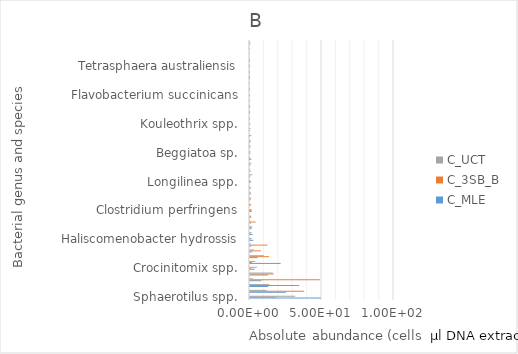
| Category | C_MLE  | C_3SB_B | C_UCT |
|---|---|---|---|
| Sphaerotilus spp. | 49.07 | 18.095 | 31.364 |
| Lewinella spp. | 24.884 | 37.664 | 11.495 |
| Tetrasphaera spp. | 12.585 | 34.158 | 13.423 |
| Lewinella sp. | 8.008 | 48.48 | 1.933 |
| Bellilinea spp. | 12.57 | 16.452 | 15.893 |
| Crocinitomix spp. | 3.218 | 0.713 | 4.715 |
| Haliscomenobacter spp. | 21.262 | 1.252 | 3.682 |
| Mycobacterium spp. | 5.26 | 13.203 | 9.741 |
| Candidatus microthrix parvicella | 1.35 | 7.605 | 2.726 |
| Candidatus monilibacter batavus | 0.831 | 12.097 | 0.792 |
| Haliscomenobacter hydrossis | 2.232 | 0.335 | 1.093 |
| Fluviicola spp. | 1.832 | 0.357 | 0.969 |
| Haliscomenobacter sp. | 0.984 | 1.19 | 1.534 |
| Levilinea spp. | 0.647 | 3.913 | 0.182 |
| Flavobacterium gelidilacus | 0.929 | 0.604 | 0 |
| Clostridium perfringens | 1.299 | 0.862 | 1.093 |
| Anaerolinea spp. | 0.294 | 0.766 | 0.071 |
| Tetrasphaera sp. | 0.43 | 0.418 | 0.848 |
| Acinetobacter johnsonii | 0.353 | 0.643 | 0.485 |
| Kouleothrix aurantiaca | 0.52 | 0.326 | 0.087 |
| Longilinea spp. | 0.232 | 0.725 | 0.143 |
| Aquicella lusitana | 0.112 | 0.045 | 1.601 |
| Anaerolinea thermolimosa | 0.509 | 0 | 0.021 |
| Tetrasphaera jenkinsii | 0.262 | 0.05 | 1.002 |
| Candidatus alysiosphaera europeae | 0.867 | 0.226 | 0.138 |
| Beggiatoa sp. | 0.181 | 0.08 | 0.439 |
| Uncultured candidatus microthrix sp. | 0.102 | 0.1 | 0.542 |
| Aquicella spp. | 0.021 | 0.704 | 0.035 |
| Levilinea saccharolytica | 0.048 | 0.861 | 0 |
| Crenothrix polyspora | 0.071 | 0 | 0.305 |
| Kouleothrix spp. | 0 | 0.23 | 0 |
| Gordonia paraffinivorans | 0.056 | 0.055 | 0 |
| Thiothrix spp. | 0.021 | 0.025 | 0.058 |
| Thiothrix sp. | 0.02 | 0.091 | 0.015 |
| Leptolinea spp. | 0 | 0.114 | 0 |
| Flavobacterium succinicans | 0.022 | 0.016 | 0 |
| Tetrasphaera vanveenii | 0.01 | 0.05 | 0.022 |
| Candidatus microthrix calida | 0 | 0.01 | 0 |
| Thiothrix disciformis | 0.024 | 0.021 | 0.007 |
| Beggiatoa spp. | 0.045 | 0.005 | 0 |
| Tetrasphaera australiensis | 0.02 | 0.02 | 0.007 |
| Bellilinea caldifistulae | 0.015 | 0.029 | 0.007 |
| Caldilinea aerophila | 0 | 0 | 0.037 |
| Thiothrix fructosivorans | 0 | 0.026 | 0 |
| Thiothrix eikelboomii | 0.177 | 0.01 | 0.137 |